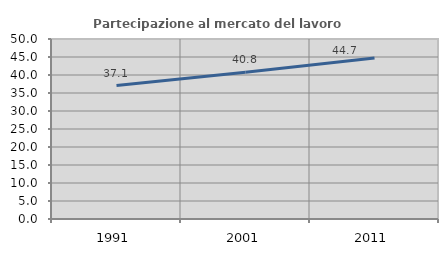
| Category | Partecipazione al mercato del lavoro  femminile |
|---|---|
| 1991.0 | 37.083 |
| 2001.0 | 40.772 |
| 2011.0 | 44.739 |